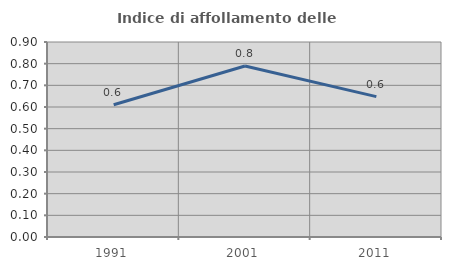
| Category | Indice di affollamento delle abitazioni  |
|---|---|
| 1991.0 | 0.61 |
| 2001.0 | 0.789 |
| 2011.0 | 0.648 |